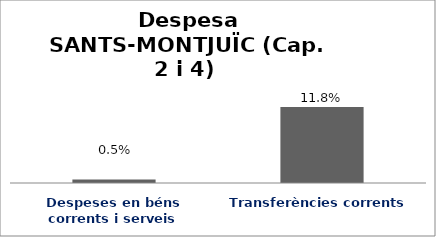
| Category | Series 0 |
|---|---|
| Despeses en béns corrents i serveis | 0.005 |
| Transferències corrents | 0.118 |